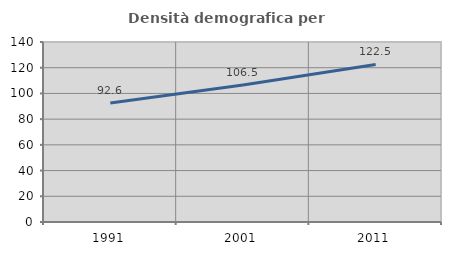
| Category | Densità demografica |
|---|---|
| 1991.0 | 92.58 |
| 2001.0 | 106.549 |
| 2011.0 | 122.514 |